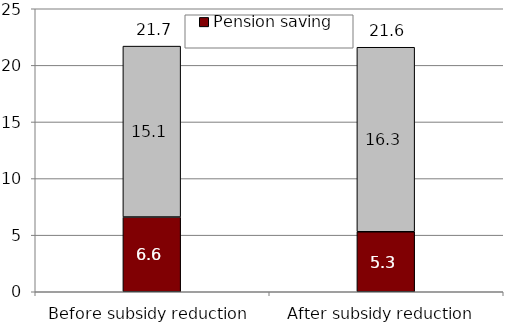
| Category | Pension saving | Non-pension saving |
|---|---|---|
| Before subsidy reduction | 6.6 | 15.1 |
| After subsidy reduction  | 5.3 | 16.3 |